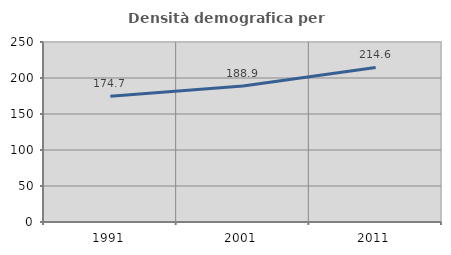
| Category | Densità demografica |
|---|---|
| 1991.0 | 174.691 |
| 2001.0 | 188.935 |
| 2011.0 | 214.629 |